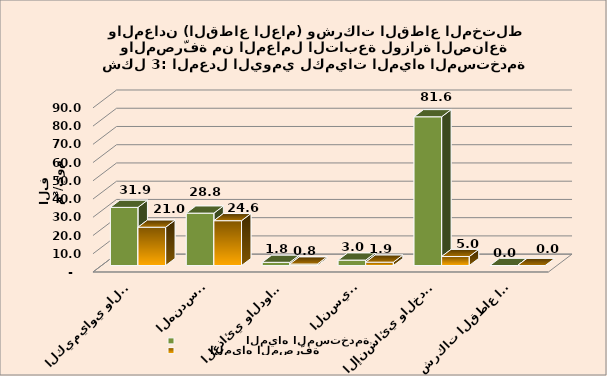
| Category |                  المياه المستخدمة                   |         المياه المصرّفة                   |
|---|---|---|
| الكيمياوي والبتروكيمياوي | 31.915 | 21.037 |
| الهندسي  | 28.761 | 24.614 |
| الغذائي والدوائي | 1.789 | 0.828 |
| النسيجي | 3.009 | 1.858 |
| الإنشائي والخدمات الصناعية | 81.587 | 4.962 |
| شركات القطاع المختلط | 0.036 | 0.026 |